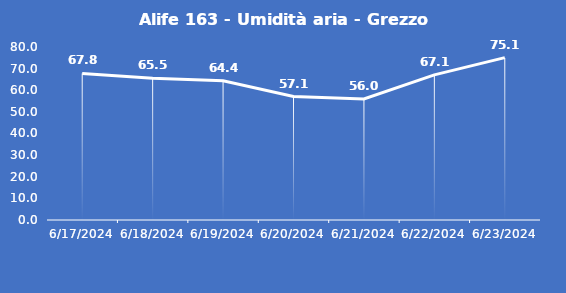
| Category | Alife 163 - Umidità aria - Grezzo (%) |
|---|---|
| 6/17/24 | 67.8 |
| 6/18/24 | 65.5 |
| 6/19/24 | 64.4 |
| 6/20/24 | 57.1 |
| 6/21/24 | 56 |
| 6/22/24 | 67.1 |
| 6/23/24 | 75.1 |